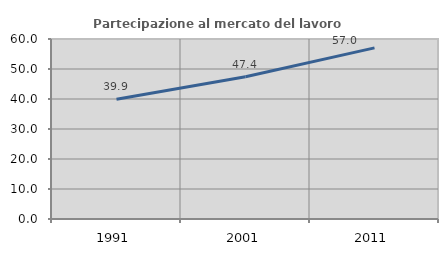
| Category | Partecipazione al mercato del lavoro  femminile |
|---|---|
| 1991.0 | 39.94 |
| 2001.0 | 47.406 |
| 2011.0 | 57.037 |